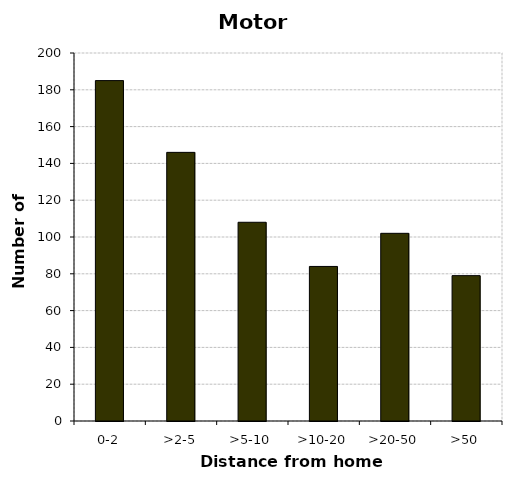
| Category | Motorcycles |
|---|---|
| 0-2 | 185 |
| >2-5 | 146 |
| >5-10 | 108 |
| >10-20 | 84 |
| >20-50 | 102 |
| >50 | 79 |